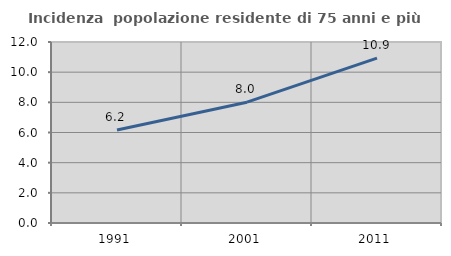
| Category | Incidenza  popolazione residente di 75 anni e più |
|---|---|
| 1991.0 | 6.161 |
| 2001.0 | 8.011 |
| 2011.0 | 10.931 |